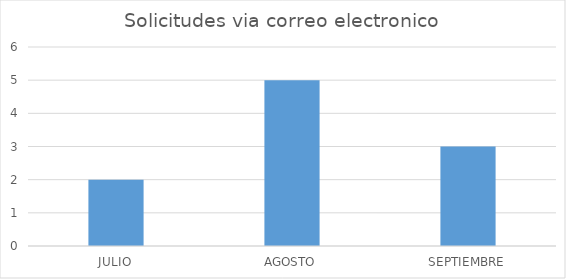
| Category | Series 0 |
|---|---|
| JULIO | 2 |
| AGOSTO | 5 |
| SEPTIEMBRE | 3 |